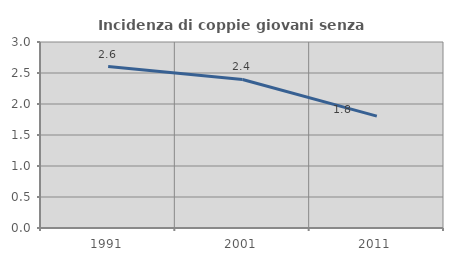
| Category | Incidenza di coppie giovani senza figli |
|---|---|
| 1991.0 | 2.603 |
| 2001.0 | 2.395 |
| 2011.0 | 1.804 |